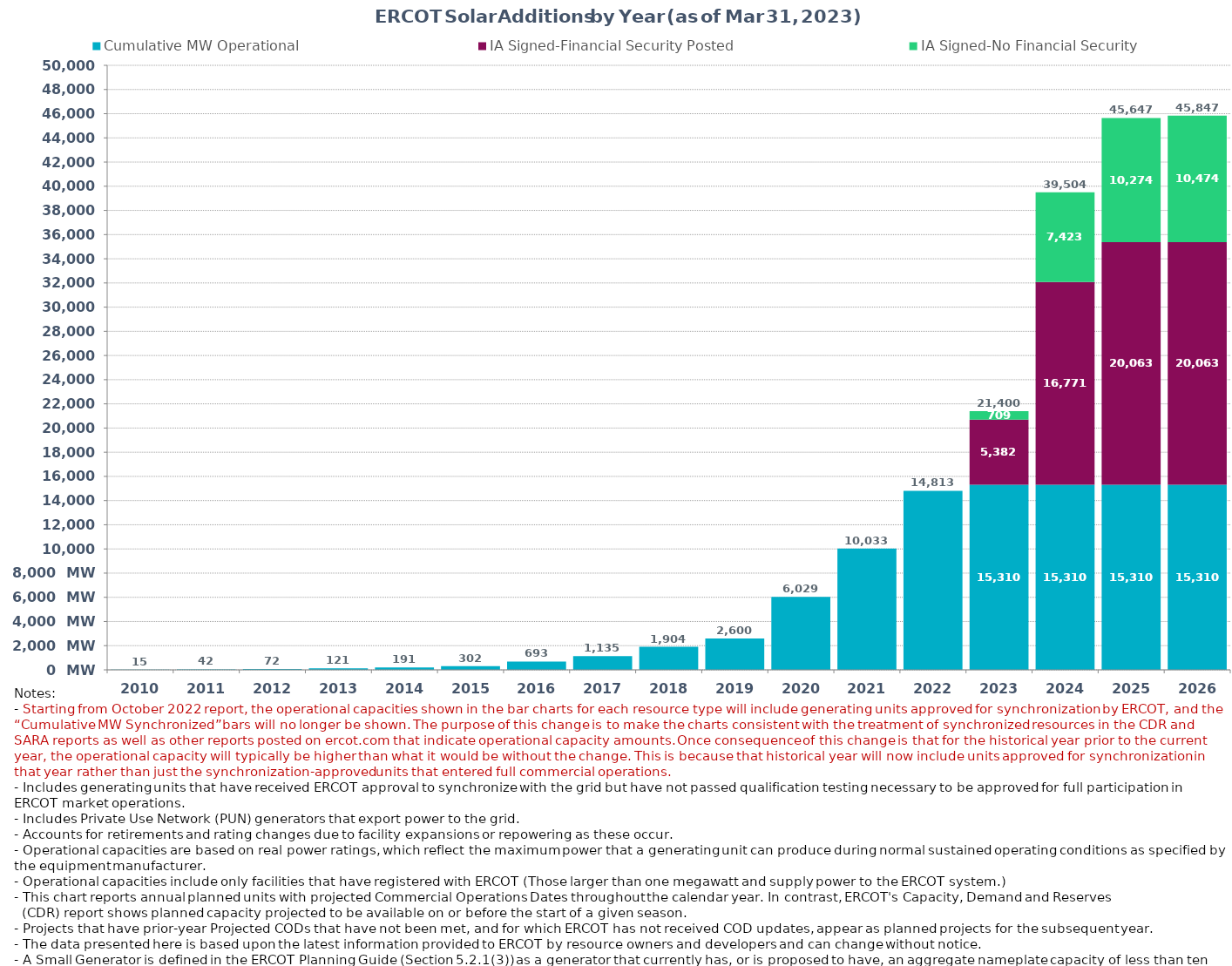
| Category | Cumulative MW Operational  | IA Signed-Financial Security Posted  | IA Signed-No Financial Security  | Small Generator | Cumulative Installed and Planned |
|---|---|---|---|---|---|
| 2010.0 | 14.9 | 0 | 0 | 0 | 14.9 |
| 2011.0 | 41.6 | 0 | 0 | 0 | 41.6 |
| 2012.0 | 72 | 0 | 0 | 0 | 72 |
| 2013.0 | 121.18 | 0 | 0 | 0 | 121.18 |
| 2014.0 | 190.7 | 0 | 0 | 0 | 190.7 |
| 2015.0 | 301.71 | 0 | 0 | 0 | 301.71 |
| 2016.0 | 693.01 | 0 | 0 | 0 | 693.01 |
| 2017.0 | 1134.91 | 0 | 0 | 0 | 1134.91 |
| 2018.0 | 1903.95 | 0 | 0 | 0 | 1903.95 |
| 2019.0 | 2600.14 | 0 | 0 | 0 | 2600.14 |
| 2020.0 | 6029.43 | 0 | 0 | 0 | 6029.43 |
| 2021.0 | 10032.91 | 0 | 0 | 0 | 10032.91 |
| 2022.0 | 14813.01 | 0 | 0 | 0 | 14813.01 |
| 2023.0 | 15310.32 | 5381.56 | 708.59 | 0 | 21400.47 |
| 2024.0 | 15310.32 | 16771.21 | 7422.74 | 0 | 39504.27 |
| 2025.0 | 15310.32 | 20062.78 | 10274.15 | 0 | 45647.25 |
| 2026.0 | 15310.32 | 20062.78 | 10474.15 | 0 | 45847.25 |